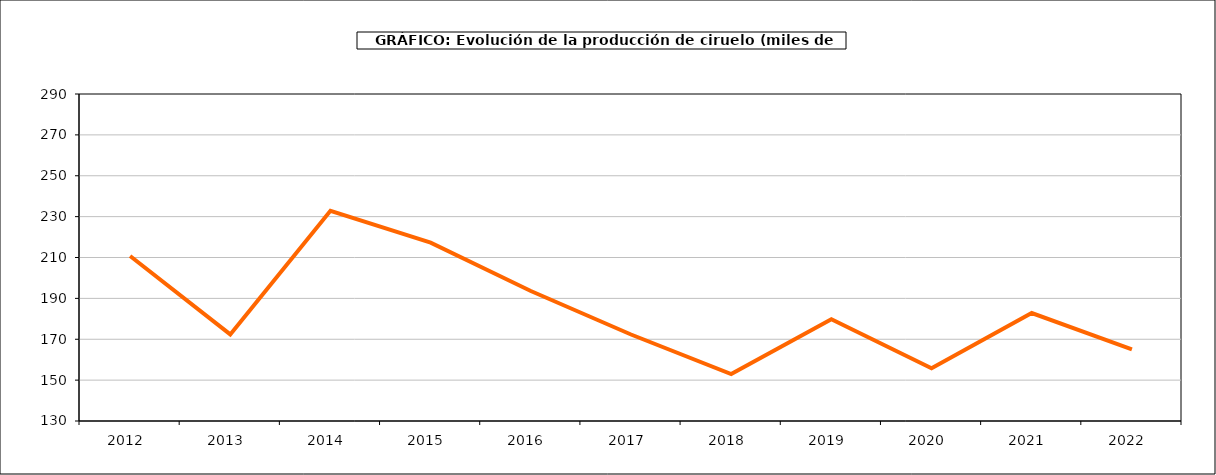
| Category | producción Ciruelo |
|---|---|
| 2012.0 | 210.726 |
| 2013.0 | 172.352 |
| 2014.0 | 232.831 |
| 2015.0 | 217.291 |
| 2016.0 | 193.598 |
| 2017.0 | 172.325 |
| 2018.0 | 152.984 |
| 2019.0 | 179.839 |
| 2020.0 | 155.834 |
| 2021.0 | 182.826 |
| 2022.0 | 165.045 |